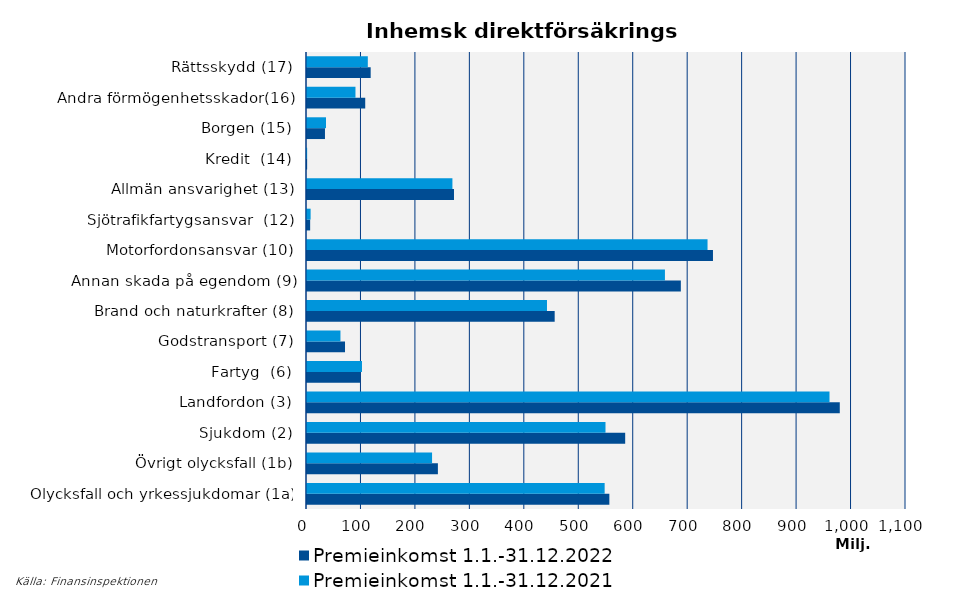
| Category | Premieinkomst |
|---|---|
| Olycksfall och yrkessjukdomar (1a) | 546603.494 |
| Övrigt olycksfall (1b) | 229666.634 |
| Sjukdom (2) | 548147.112 |
| Landfordon (3) | 959533.408 |
| Fartyg  (6) | 100976.853 |
| Godstransport (7) | 61440.176 |
| Brand och naturkrafter (8) | 440706.467 |
| Annan skada på egendom (9) | 657311.877 |
| Motorfordonsansvar (10) | 735547.806 |
| Sjötrafikfartygsansvar  (12) | 6641.662 |
| Allmän ansvarighet (13) | 267045.957 |
| Kredit  (14) | 262.555 |
| Borgen (15) | 34864.393 |
| Andra förmögenhetsskador(16) | 89013.981 |
| Rättsskydd (17) | 111682.6 |